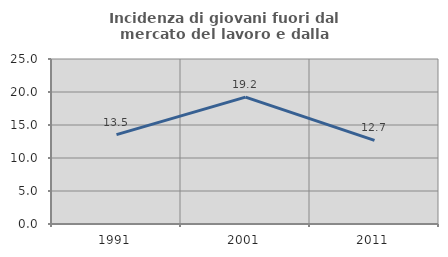
| Category | Incidenza di giovani fuori dal mercato del lavoro e dalla formazione  |
|---|---|
| 1991.0 | 13.547 |
| 2001.0 | 19.231 |
| 2011.0 | 12.68 |